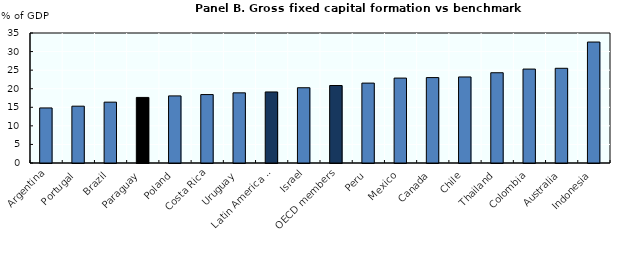
| Category | Series 0 |
|---|---|
| Argentina | 14.822 |
| Portugal | 15.298 |
| Brazil | 16.385 |
| Paraguay | 17.655 |
| Poland | 18.067 |
| Costa Rica | 18.422 |
| Uruguay | 18.887 |
| Latin America & Caribbean | 19.129 |
| Israel | 20.264 |
| OECD members | 20.863 |
| Peru | 21.511 |
| Mexico | 22.86 |
| Canada | 22.997 |
| Chile | 23.165 |
| Thailand | 24.298 |
| Colombia | 25.289 |
| Australia | 25.499 |
| Indonesia | 32.567 |